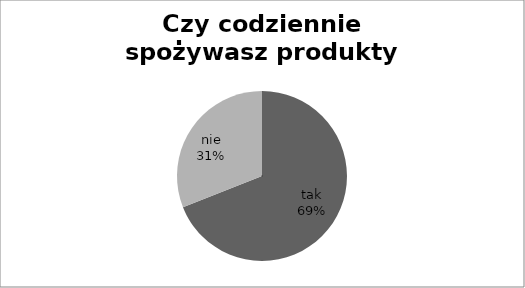
| Category | Czy codziennie spożywasz produkty mleczne? |
|---|---|
| tak | 69 |
| nie | 31 |